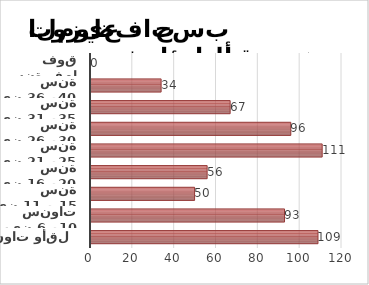
| Category | Series 1 |
|---|---|
| 5 سنوات وأقل | 109 |
| ما بين 6 و10 سنوات | 93 |
| ما بين 11 و 15 سنة | 50 |
| ما بين 16 و20 سنة | 56 |
| ما بين 21 و25 سنة | 111 |
| ما بين 26 و30 سنة | 96 |
| ما بين 31 و35 سنة | 67 |
| ما بين 36 و40 سنة | 34 |
| 41 سنة فما فوق | 0 |